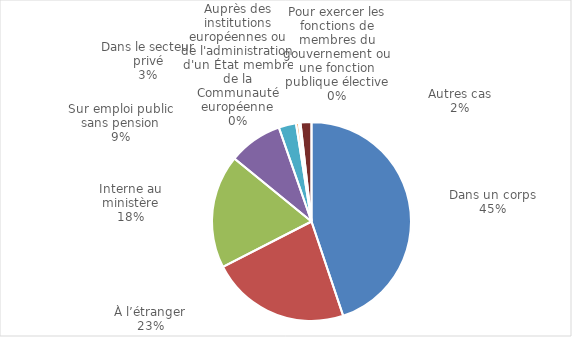
| Category | Détachement |
|---|---|
| Dans un corps | 0.448 |
| À l’étranger | 0.226 |
| Interne au ministère | 0.184 |
| Sur emploi public sans pension | 0.088 |
| Dans le secteur privé | 0.028 |
| Auprès des institutions européennes ou de l'administration d'un État membre de la Communauté européenne | 0.005 |
| Pour exercer les fonctions de membres du gouvernement ou une fonction publique élective | 0.003 |
| Autres cas | 0.018 |